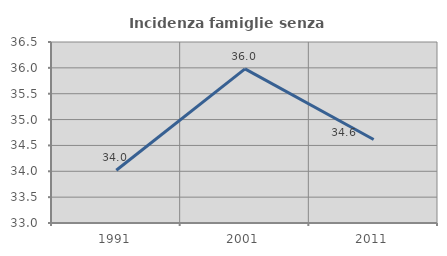
| Category | Incidenza famiglie senza nuclei |
|---|---|
| 1991.0 | 34.021 |
| 2001.0 | 35.981 |
| 2011.0 | 34.615 |